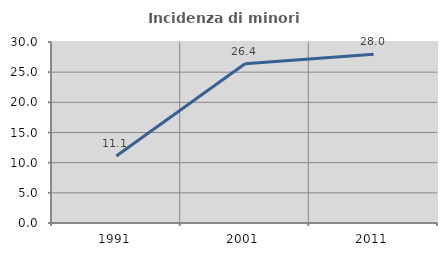
| Category | Incidenza di minori stranieri |
|---|---|
| 1991.0 | 11.111 |
| 2001.0 | 26.389 |
| 2011.0 | 27.966 |